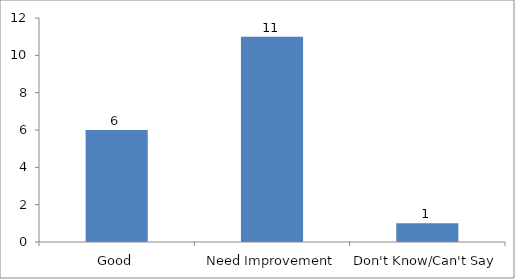
| Category | How would you rate the following aspects of the social entrepreneurship program of PVTC? i.The entrepreneurial capacities that the program develop in youth |
|---|---|
| Good | 6 |
| Need Improvement | 11 |
| Don't Know/Can't Say | 1 |